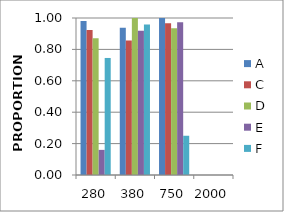
| Category | A | C | D | E | F |
|---|---|---|---|---|---|
| 280.0 | 0.981 | 0.923 | 0.872 | 0.16 | 0.745 |
| 380.0 | 0.938 | 0.857 | 1 | 0.919 | 0.958 |
| 750.0 | 1 | 0.967 | 0.935 | 0.972 | 0.25 |
| 2000.0 | 0 | 0 | 0 | 0 | 0 |